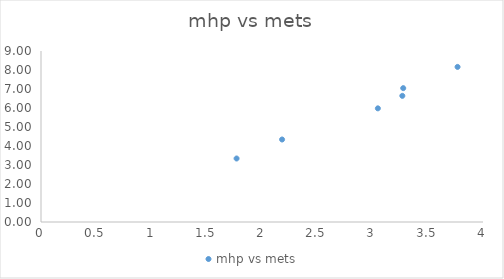
| Category | mhp vs mets |
|---|---|
| 1.769939089568744 | 3.342 |
| 2.1817592046524967 | 4.342 |
| 3.0485519924642683 | 5.982 |
| 3.2699763279682204 | 6.64 |
| 3.278004443625344 | 7.045 |
| 3.769744993242414 | 8.162 |